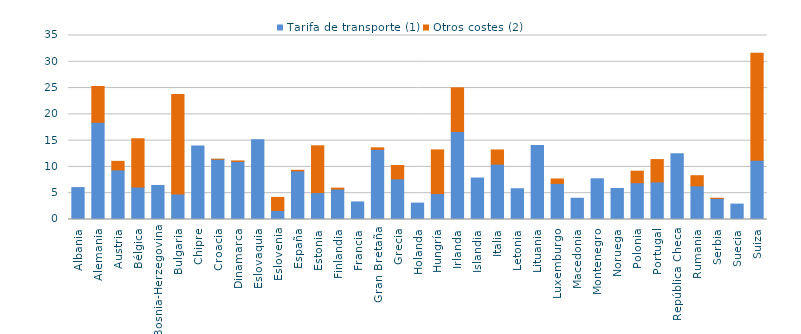
| Category | Tarifa de transporte (1) | Otros costes (2) |
|---|---|---|
| Albania | 6.077 | 0 |
| Alemania | 18.49 | 6.81 |
| Austria | 9.43 | 1.63 |
| Bélgica | 6.171 | 9.186 |
| Bosnia-Herzegovina | 6.478 | 0 |
| Bulgaria | 4.87 | 18.92 |
| Chipre | 14 | 0 |
| Croacia | 11.455 | 0.007 |
| Dinamarca | 11.05 | 0.09 |
| Eslovaquia | 15.159 | 0 |
| Eslovenia | 1.723 | 2.48 |
| España | 9.247 | 0.114 |
| Estonia | 5.12 | 8.9 |
| Finlandia | 5.782 | 0.186 |
| Francia | 3.342 | 0 |
| Gran Bretaña | 13.339 | 0.3 |
| Grecia | 7.728 | 2.54 |
| Holanda | 3.12 | 0 |
| Hungría | 4.93 | 8.309 |
| Irlanda | 16.74 | 8.3 |
| Islandia | 7.89 | 0 |
| Italia | 10.54 | 2.69 |
| Letonia | 5.85 | 0 |
| Lituania | 14.09 | 0 |
| Luxemburgo | 6.858 | 0.85 |
| Macedonia | 4.04 | 0 |
| Montenegro | 7.744 | 0 |
| Noruega | 5.9 | 0 |
| Polonia | 6.996 | 2.193 |
| Portugal | 7.15 | 4.249 |
| República Checa | 12.52 | 0 |
| Rumania | 6.4 | 1.93 |
| Serbia | 4.008 | 0.028 |
| Suecia | 2.93 | 0 |
| Suiza | 11.26 | 20.38 |